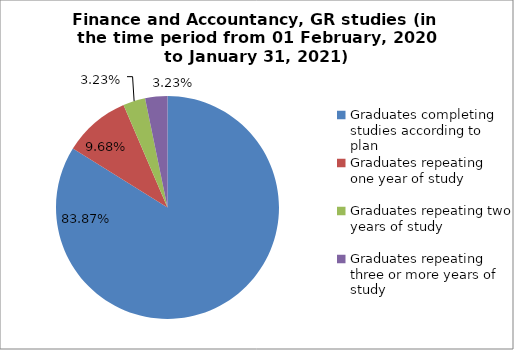
| Category | Series 0 |
|---|---|
| Graduates completing studies according to plan | 83.871 |
| Graduates repeating one year of study | 9.677 |
| Graduates repeating two years of study | 3.226 |
| Graduates repeating three or more years of study | 3.226 |